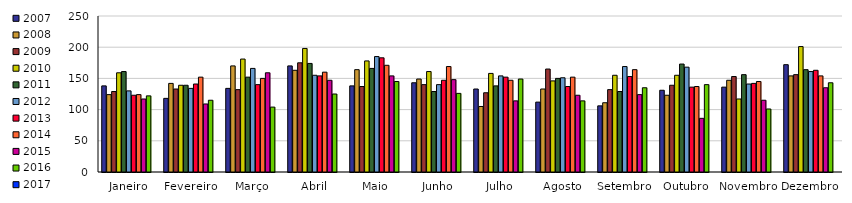
| Category | 2007 | 2008 | 2009 | 2010 | 2011 | 2012 | 2013 | 2014 | 2015 | 2016 | 2017 |
|---|---|---|---|---|---|---|---|---|---|---|---|
| Janeiro | 138 | 124 | 129 | 159 | 161 | 130 | 123 | 124 | 117 | 122 |  |
| Fevereiro | 118 | 142 | 133 | 139 | 139 | 134 | 141 | 152 | 109 | 115 |  |
| Março | 134 | 170 | 132 | 181 | 152 | 166 | 140 | 150 | 159 | 104 |  |
| Abril | 170 | 163 | 175 | 198 | 174 | 155 | 154 | 160 | 147 | 125 |  |
| Maio | 138 | 164 | 137 | 178 | 166 | 185 | 183 | 171 | 154 | 145 |  |
| Junho | 143 | 149 | 140 | 161 | 129 | 140 | 147 | 169 | 148 | 126 |  |
| Julho | 133 | 105 | 127 | 158 | 138 | 154 | 152 | 147 | 114 | 149 |  |
| Agosto | 112 | 133 | 165 | 146 | 150 | 151 | 137 | 152 | 123 | 114 |  |
| Setembro | 106 | 111 | 132 | 155 | 129 | 169 | 153 | 164 | 124 | 135 |  |
| Outubro | 131 | 123 | 139 | 155 | 173 | 168 | 136 | 137 | 86 | 140 |  |
| Novembro | 136 | 147 | 153 | 117 | 156 | 141 | 142 | 145 | 115 | 101 |  |
| Dezembro | 172 | 154 | 156 | 201 | 164 | 161 | 163 | 154 | 135 | 143 |  |